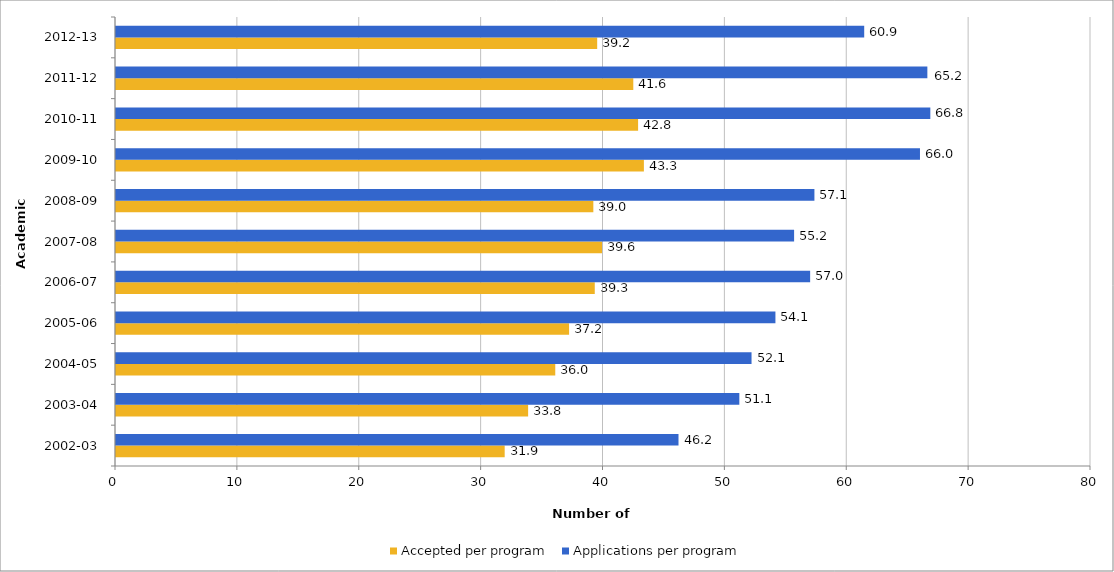
| Category | Accepted per program | Applications per program |
|---|---|---|
| 2002-03 | 31.892 | 46.154 |
| 2003-04 | 33.816 | 51.145 |
| 2004-05 | 36.042 | 52.147 |
| 2005-06 | 37.177 | 54.107 |
| 2006-07 | 39.284 | 56.955 |
| 2007-08 | 39.877 | 55.639 |
| 2008-09 | 39.166 | 57.306 |
| 2009-10 | 43.314 | 65.968 |
| 2010-11 | 42.839 | 66.817 |
| 2011-12 | 42.445 | 66.573 |
| 2012-13 | 39.482 | 61.391 |